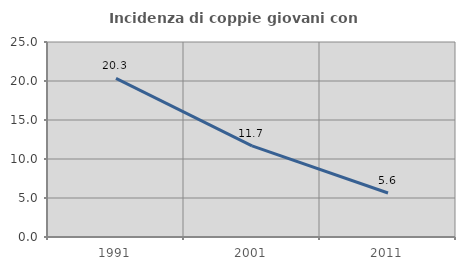
| Category | Incidenza di coppie giovani con figli |
|---|---|
| 1991.0 | 20.331 |
| 2001.0 | 11.683 |
| 2011.0 | 5.643 |